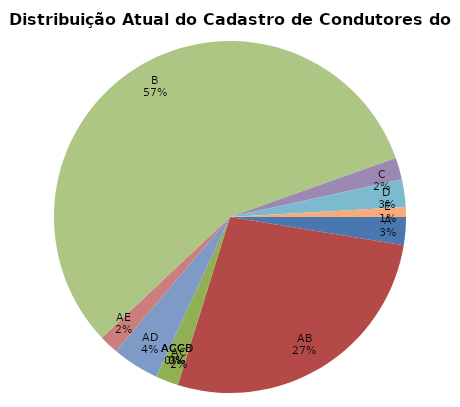
| Category | PERÍODO COMPETÊNCIA |
|---|---|
| A | 140539 |
| AB | 1490154 |
| AC | 114435 |
| ACC | 79 |
| ACCB | 44 |
| ACCD | 1 |
| AD | 237329 |
| AE | 96454 |
| B | 3097353 |
| C | 109223 |
| D | 139101 |
| E | 49452 |